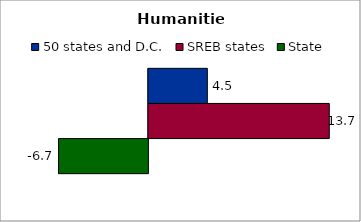
| Category | 50 states and D.C. | SREB states | State |
|---|---|---|---|
| 0 | 4.451 | 13.662 | -6.748 |